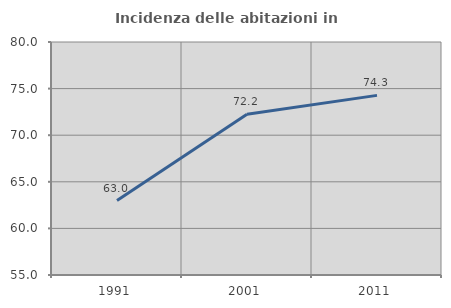
| Category | Incidenza delle abitazioni in proprietà  |
|---|---|
| 1991.0 | 62.989 |
| 2001.0 | 72.25 |
| 2011.0 | 74.272 |